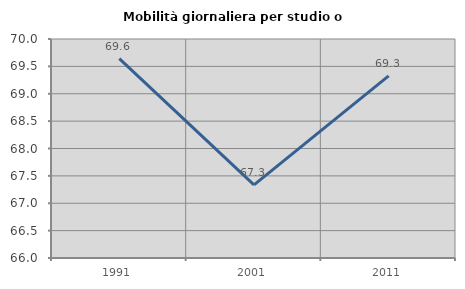
| Category | Mobilità giornaliera per studio o lavoro |
|---|---|
| 1991.0 | 69.643 |
| 2001.0 | 67.337 |
| 2011.0 | 69.326 |